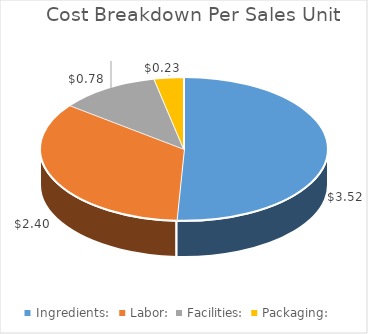
| Category | Series 0 |
|---|---|
| Ingredients:   | 3.52 |
| Labor:  | 2.395 |
| Facilities:  | 0.781 |
| Packaging:  | 0.23 |